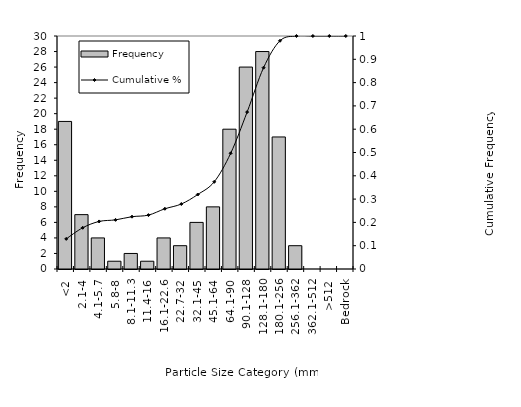
| Category | Frequency |
|---|---|
| <2 | 19 |
| 2.1-4 | 7 |
| 4.1-5.7 | 4 |
| 5.8-8 | 1 |
| 8.1-11.3 | 2 |
| 11.4-16 | 1 |
| 16.1-22.6 | 4 |
| 22.7-32 | 3 |
| 32.1-45 | 6 |
| 45.1-64 | 8 |
| 64.1-90 | 18 |
| 90.1-128 | 26 |
| 128.1-180 | 28 |
| 180.1-256 | 17 |
| 256.1-362 | 3 |
| 362.1-512 | 0 |
| >512 | 0 |
| Bedrock | 0 |